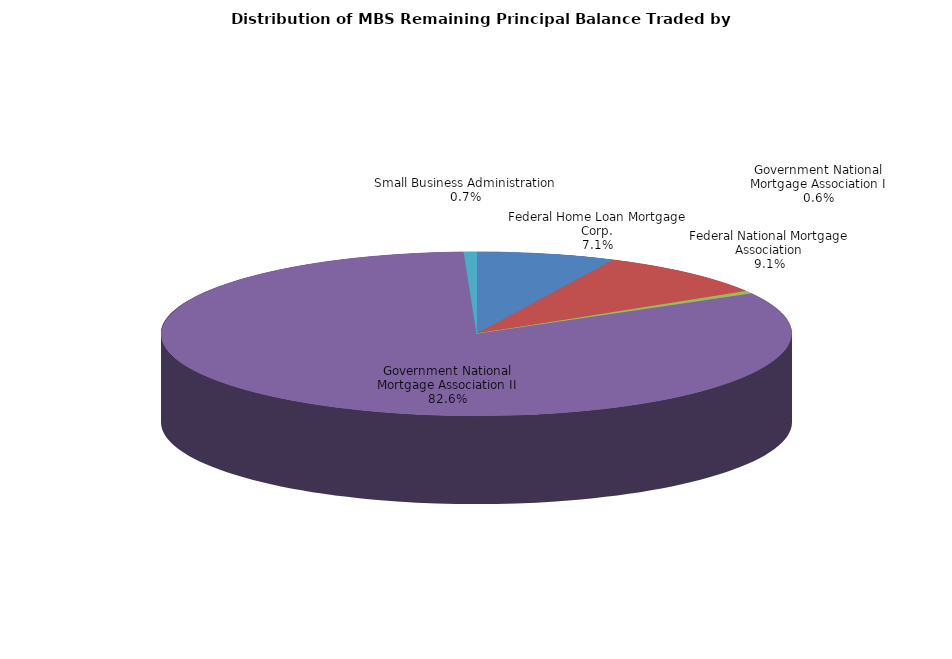
| Category | Series 0 |
|---|---|
| Federal Home Loan Mortgage Corp. | 612443223.926 |
| Federal National Mortgage Association | 785531320.652 |
| Government National Mortgage Association I | 47689637.096 |
| Government National Mortgage Association II | 7108308918.831 |
| Small Business Administration | 56025997.203 |